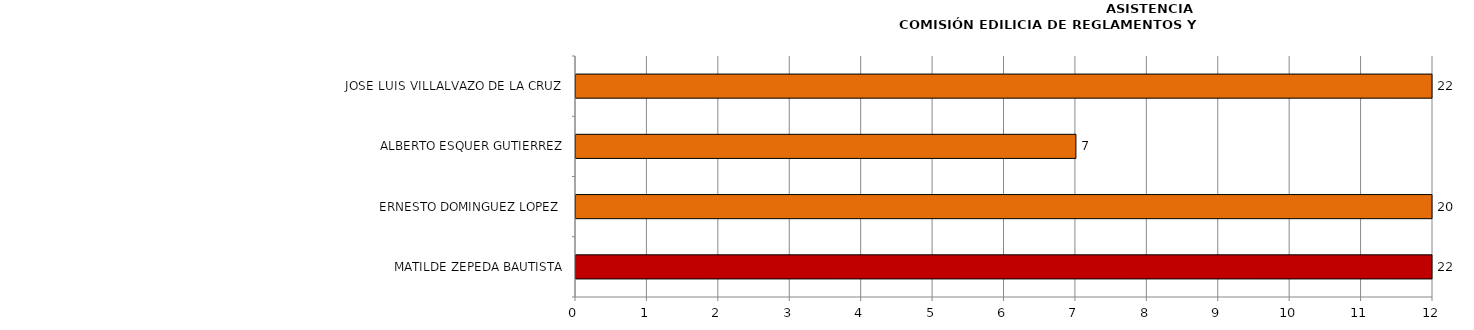
| Category | Series 0 |
|---|---|
| MATILDE ZEPEDA BAUTISTA | 22 |
| ERNESTO DOMINGUEZ LOPEZ  | 20 |
| ALBERTO ESQUER GUTIERREZ | 7 |
| JOSE LUIS VILLALVAZO DE LA CRUZ  | 22 |